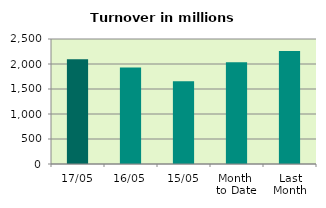
| Category | Series 0 |
|---|---|
| 17/05 | 2096.943 |
| 16/05 | 1928.788 |
| 15/05 | 1656.728 |
| Month 
to Date | 2036.45 |
| Last
Month | 2261.282 |